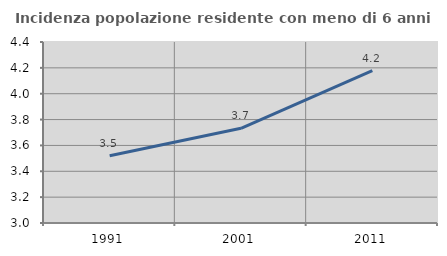
| Category | Incidenza popolazione residente con meno di 6 anni |
|---|---|
| 1991.0 | 3.521 |
| 2001.0 | 3.732 |
| 2011.0 | 4.179 |